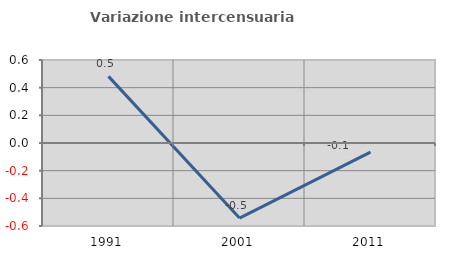
| Category | Variazione intercensuaria annua |
|---|---|
| 1991.0 | 0.482 |
| 2001.0 | -0.543 |
| 2011.0 | -0.066 |